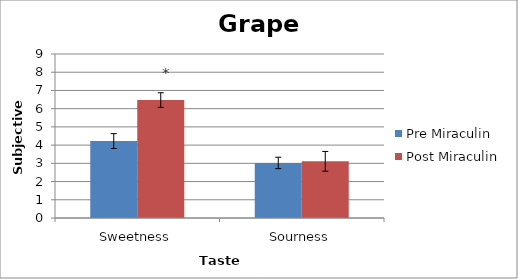
| Category | Pre Miraculin | Post Miraculin |
|---|---|---|
| Sweetness | 4.222 | 6.472 |
| Sourness | 3.022 | 3.111 |